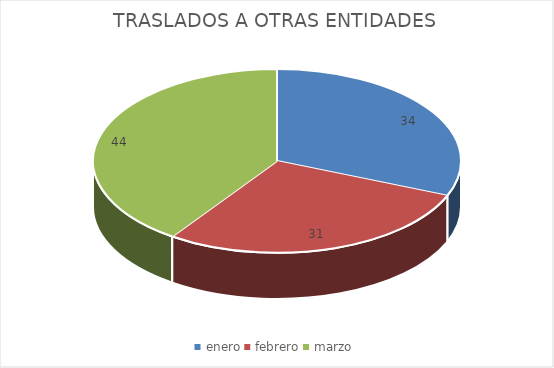
| Category | TRASLADOS A OTRAS ENTIDADES  |
|---|---|
| enero | 34 |
| febrero | 31 |
| marzo | 44 |